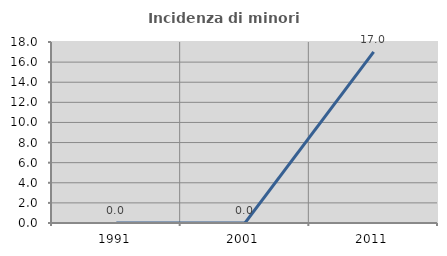
| Category | Incidenza di minori stranieri |
|---|---|
| 1991.0 | 0 |
| 2001.0 | 0 |
| 2011.0 | 17.021 |